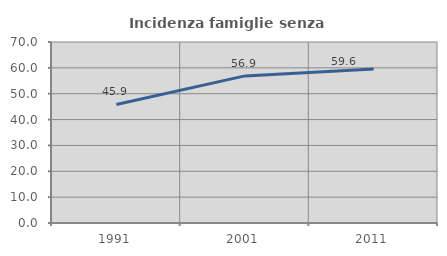
| Category | Incidenza famiglie senza nuclei |
|---|---|
| 1991.0 | 45.856 |
| 2001.0 | 56.886 |
| 2011.0 | 59.574 |